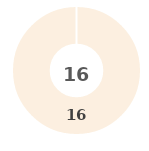
| Category | Series 0 |
|---|---|
| 0 | 0 |
| 1 | 0 |
| 2 | 0 |
| 3 | 0 |
| 4 | 16 |